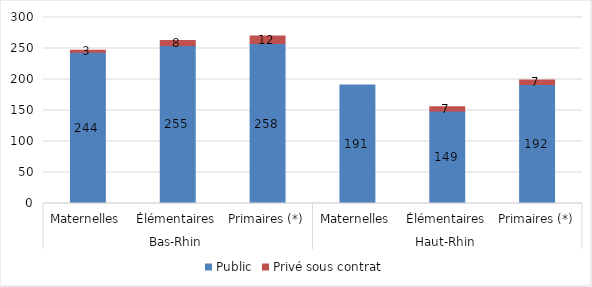
| Category | Public | Privé sous contrat |
|---|---|---|
| 0 | 244 | 3 |
| 1 | 255 | 8 |
| 2 | 258 | 12 |
| 3 | 191 | 0 |
| 4 | 149 | 7 |
| 5 | 192 | 7 |